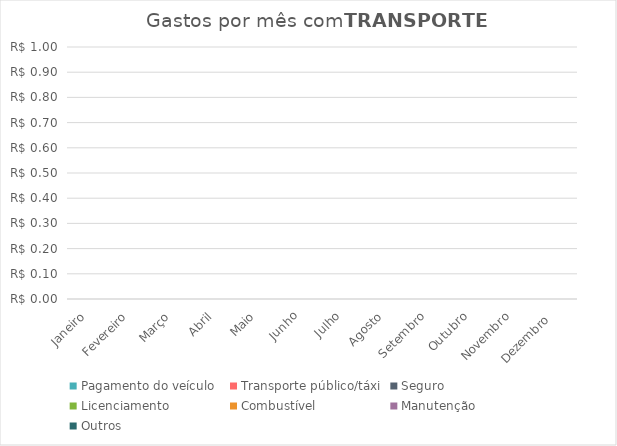
| Category | Pagamento do veículo | Transporte público/táxi | Seguro | Licenciamento | Combustível | Manutenção | Outros |
|---|---|---|---|---|---|---|---|
| Janeiro | 0 | 0 | 0 | 0 | 0 | 0 | 0 |
| Fevereiro | 0 | 0 | 0 | 0 | 0 | 0 | 0 |
| Março | 0 | 0 | 0 | 0 | 0 | 0 | 0 |
| Abril | 0 | 0 | 0 | 0 | 0 | 0 | 0 |
| Maio | 0 | 0 | 0 | 0 | 0 | 0 | 0 |
| Junho | 0 | 0 | 0 | 0 | 0 | 0 | 0 |
| Julho | 0 | 0 | 0 | 0 | 0 | 0 | 0 |
| Agosto | 0 | 0 | 0 | 0 | 0 | 0 | 0 |
| Setembro | 0 | 0 | 0 | 0 | 0 | 0 | 0 |
| Outubro | 0 | 0 | 0 | 0 | 0 | 0 | 0 |
| Novembro | 0 | 0 | 0 | 0 | 0 | 0 | 0 |
| Dezembro  | 0 | 0 | 0 | 0 | 0 | 0 | 0 |